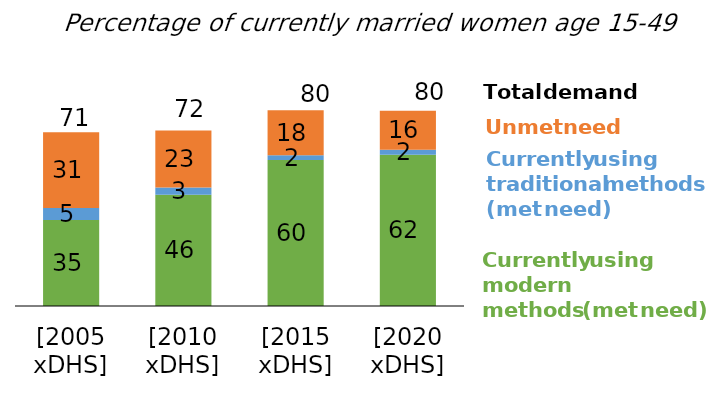
| Category | Met need modern method | Met need traditional method | Unmet need |
|---|---|---|---|
| [2005 xDHS] | 35.2 | 5 | 31 |
| [2010 xDHS] | 45.6 | 3 | 23.3 |
| [2015 xDHS] | 59.8 | 2 | 18.4 |
| [2020 xDHS] | 62 | 2 | 16 |